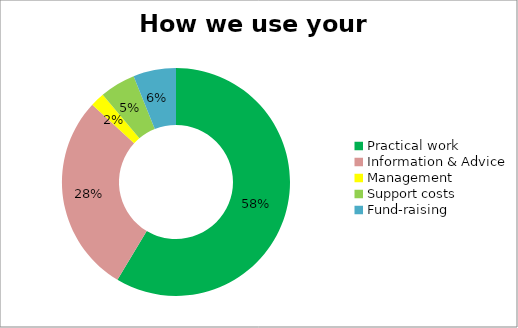
| Category | Series 0 |
|---|---|
| Practical work | 0.58 |
| Information & Advice | 0.28 |
| Management | 0.02 |
| Support costs | 0.05 |
| Fund-raising | 0.06 |